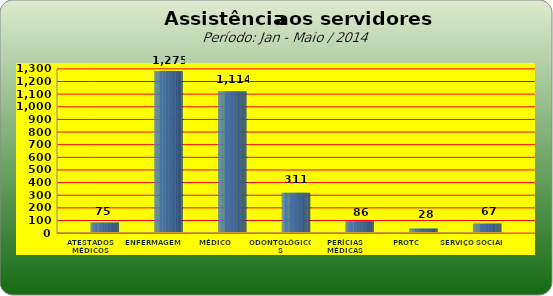
| Category | Series 0 |
|---|---|
| ATESTADOS MÉDICOS | 75 |
| ENFERMAGEM | 1275 |
| MÉDICO | 1114 |
| ODONTOLÓGICOS | 311 |
| PERÍCIAS MÉDICAS | 86 |
| PROTC | 28 |
| SERVIÇO SOCIAL | 67 |